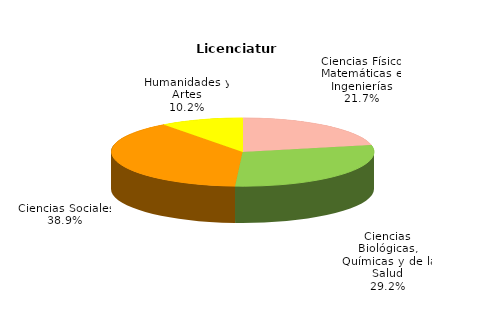
| Category | Series 0 |
|---|---|
| Ciencias Físico Matemáticas e Ingenierías | 46172 |
| Ciencias Biológicas, Químicas y de la Salud | 62237 |
| Ciencias Sociales | 82866 |
| Humanidades y Artes | 21729 |